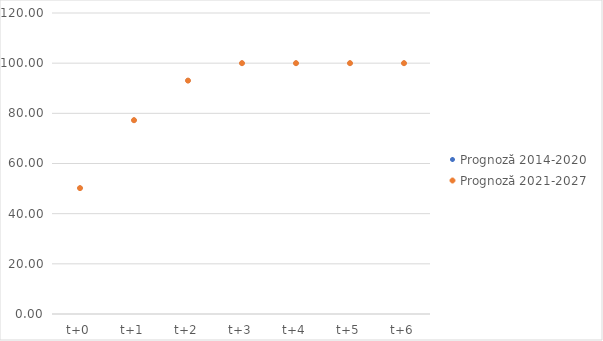
| Category | Prognoză 2014-2020 | Prognoză 2021-2027 |
|---|---|---|
| t+0 | 50.191 | 50.191 |
| t+1 | 77.265 | 77.265 |
| t+2 | 93.047 | 93.047 |
| t+3 | 100 | 100 |
| t+4 | 100 | 100 |
| t+5 | 100 | 100 |
| t+6 | 100 | 100 |